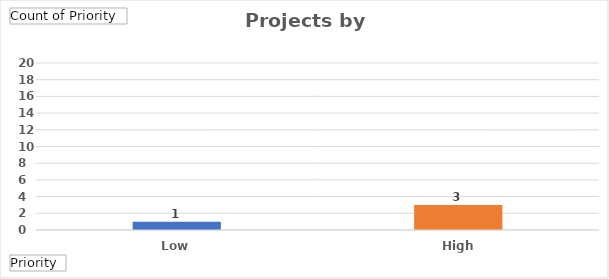
| Category | Total |
|---|---|
| Low  | 1 |
| High | 3 |